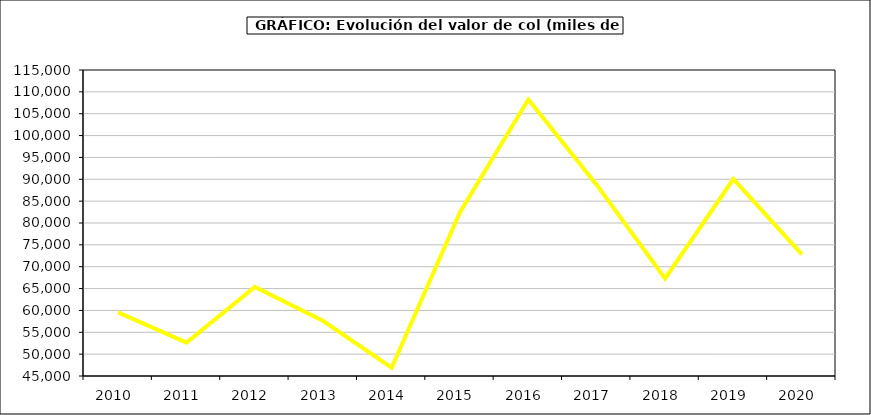
| Category | Valor |
|---|---|
| 2010.0 | 59556.292 |
| 2011.0 | 52642.369 |
| 2012.0 | 65369.978 |
| 2013.0 | 57574.735 |
| 2014.0 | 46884.616 |
| 2015.0 | 82468.9 |
| 2016.0 | 108241.9 |
| 2017.0 | 88707.96 |
| 2018.0 | 67321.637 |
| 2019.0 | 90049.076 |
| 2020.0 | 72831.571 |